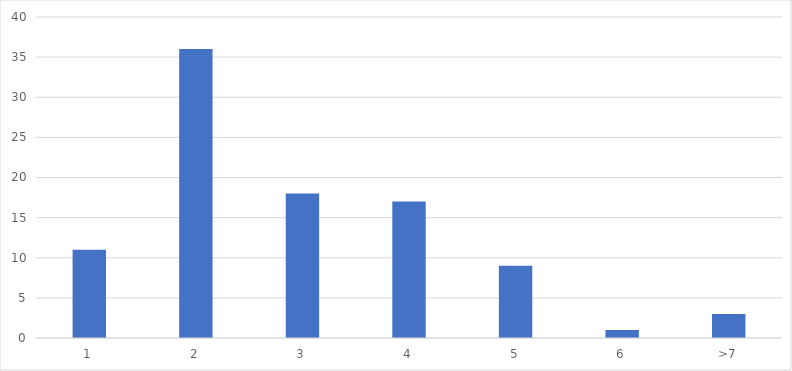
| Category | Number of Responses |
|---|---|
| 1 | 11 |
| 2 | 36 |
| 3 | 18 |
| 4 | 17 |
| 5 | 9 |
| 6 | 1 |
| >7 | 3 |